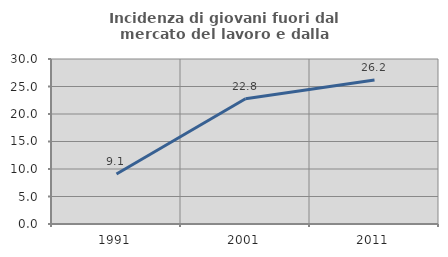
| Category | Incidenza di giovani fuori dal mercato del lavoro e dalla formazione  |
|---|---|
| 1991.0 | 9.091 |
| 2001.0 | 22.785 |
| 2011.0 | 26.19 |